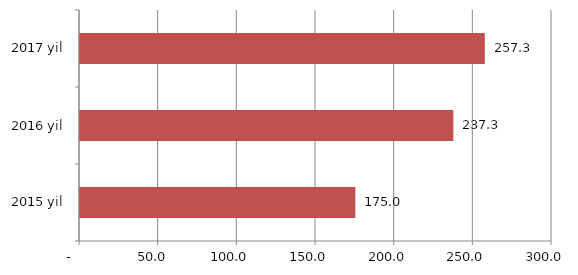
| Category | Series 0 |
|---|---|
| 2015 yil | 175 |
| 2016 yil | 237.3 |
| 2017 yil | 257.3 |